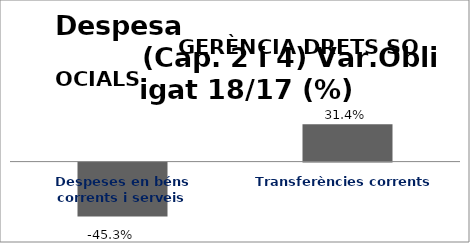
| Category | Series 0 |
|---|---|
| Despeses en béns corrents i serveis | -0.453 |
| Transferències corrents | 0.314 |